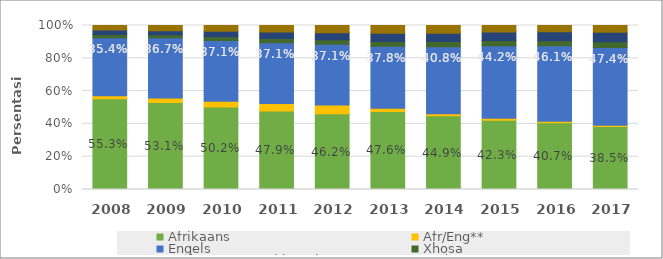
| Category | Afrikaans | Afr/Eng** | Engels | Xhosa | Ander SA Amptelike tale | Ander |
|---|---|---|---|---|---|---|
| 2008 | 0.553 | 0.018 | 0.354 | 0.019 | 0.029 | 0.027 |
| 2009 | 0.531 | 0.028 | 0.367 | 0.017 | 0.026 | 0.031 |
| 2010 | 0.502 | 0.035 | 0.371 | 0.022 | 0.034 | 0.035 |
| 2011 | 0.479 | 0.045 | 0.371 | 0.025 | 0.04 | 0.04 |
| 2012 | 0.462 | 0.053 | 0.371 | 0.028 | 0.043 | 0.044 |
| 2013 | 0.476 | 0.019 | 0.378 | 0.03 | 0.05 | 0.048 |
| 2014 | 0.449 | 0.013 | 0.408 | 0.032 | 0.051 | 0.047 |
| 2015 | 0.423 | 0.011 | 0.442 | 0.032 | 0.053 | 0.039 |
| 2016 | 0.407 | 0.009 | 0.461 | 0.031 | 0.054 | 0.039 |
| 2017 | 0.385 | 0.008 | 0.474 | 0.034 | 0.058 | 0.042 |